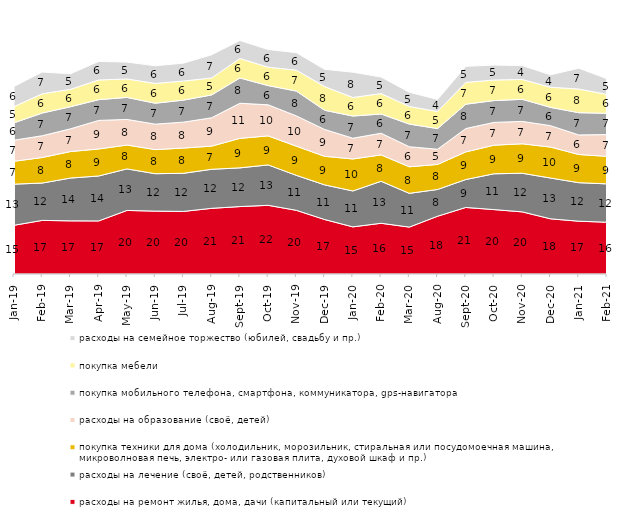
| Category | расходы на ремонт жилья, дома, дачи (капитальный или текущий) | расходы на лечение (своё, детей, родственников) | покупка техники для дома (холодильник, морозильник, стиральная или посудомоечная машина, микроволновая печь, электро- или газовая плита, духовой шкаф и пр.) | расходы на образование (своё, детей) | покупка мобильного телефона, смартфона, коммуникатора, gps-навигатора | покупка мебели | расходы на семейное торжество (юбилей, свадьбу и пр.) |
|---|---|---|---|---|---|---|---|
| 2019-01-01 | 15.45 | 13.05 | 7.25 | 6.7 | 5.5 | 5.15 | 6.4 |
| 2019-02-01 | 17 | 11.85 | 8.1 | 6.9 | 7.2 | 6.1 | 6.9 |
| 2019-03-01 | 16.857 | 13.575 | 8.404 | 7.21 | 7.011 | 5.52 | 4.923 |
| 2019-04-01 | 16.832 | 14.257 | 8.564 | 9.059 | 6.584 | 6.238 | 5.891 |
| 2019-05-01 | 20.158 | 13.175 | 7.578 | 8.123 | 6.984 | 5.844 | 5.349 |
| 2019-06-01 | 19.95 | 11.87 | 7.631 | 8.08 | 6.633 | 6.284 | 5.586 |
| 2019-07-01 | 19.851 | 12.079 | 8.02 | 8.218 | 6.98 | 6.04 | 5.693 |
| 2019-08-01 | 20.829 | 12.388 | 7.343 | 8.991 | 7.243 | 5.395 | 7.343 |
| 2019-09-01 | 21.386 | 12.277 | 9.356 | 11.139 | 8.02 | 6.188 | 5.693 |
| 2019-10-01 | 21.782 | 12.822 | 9.208 | 9.851 | 6.089 | 5.842 | 5.594 |
| 2019-11-01 | 20.198 | 11.089 | 9.257 | 9.604 | 7.871 | 6.634 | 5.545 |
| 2019-12-01 | 17.277 | 10.99 | 9.059 | 8.515 | 6.089 | 7.525 | 5.446 |
| 2020-01-01 | 14.95 | 11.386 | 10.149 | 6.584 | 7.03 | 5.891 | 8.02 |
| 2020-02-01 | 16.089 | 13.317 | 8.366 | 6.881 | 6.089 | 6.485 | 5.248 |
| 2020-03-01 | 14.874 | 10.709 | 8.428 | 6.346 | 7.189 | 5.602 | 4.512 |
| 2020-08-01 | 18.322 | 8.491 | 7.944 | 4.816 | 6.554 | 5.412 | 3.823 |
| 2020-09-01 | 21.105 | 8.86 | 8.761 | 7.417 | 7.715 | 6.919 | 5.077 |
| 2020-10-01 | 20.428 | 11.36 | 9.068 | 7.225 | 6.926 | 6.527 | 4.733 |
| 2020-11-01 | 19.7 | 12.25 | 9.35 | 7.1 | 7 | 6.3 | 4.4 |
| 2020-12-01 | 17.501 | 12.94 | 9.817 | 6.792 | 5.801 | 6.396 | 3.917 |
| 2021-01-01 | 16.741 | 12.221 | 8.942 | 6.21 | 7.054 | 7.501 | 6.607 |
| 2021-02-01 | 16.427 | 12.159 | 8.734 | 6.898 | 6.749 | 6.005 | 4.963 |